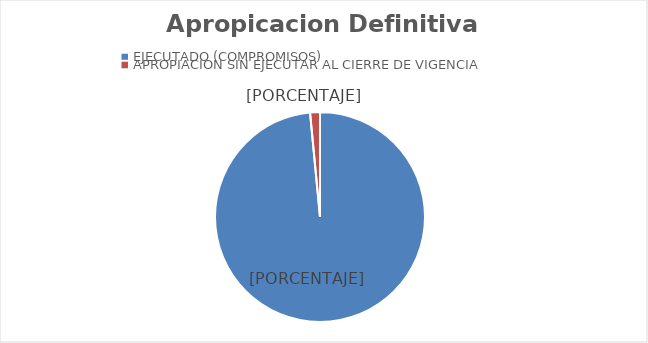
| Category | Series 0 |
|---|---|
| EJECUTADO (COMPROMISOS) | 817779217812.13 |
| APROPIACION SIN EJECUTAR AL CIERRE DE VIGENCIA | 12584652430.87 |